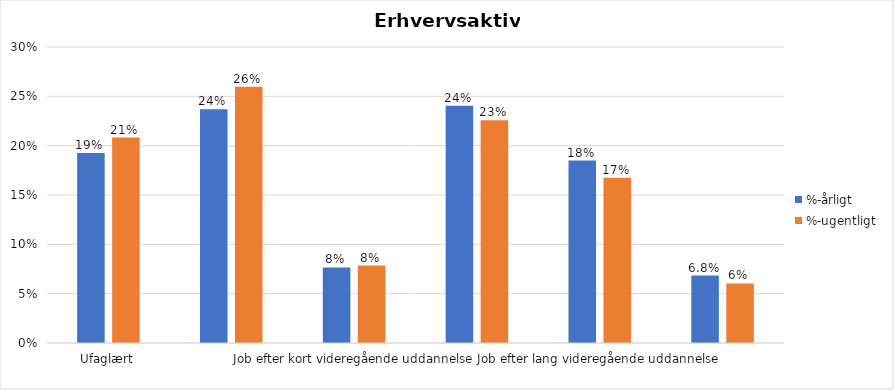
| Category | %-årligt | %-ugentligt |
|---|---|---|
| Ufaglært | 0.193 | 0.208 |
| Erhvervsfagligt job | 0.237 | 0.26 |
| Job efter kort videregående uddannelse | 0.077 | 0.078 |
| Job efter mellemlang videregående uddannelse | 0.241 | 0.226 |
| Job efter lang videregående uddannelse | 0.185 | 0.168 |
| Selvstændig | 0.068 | 0.06 |